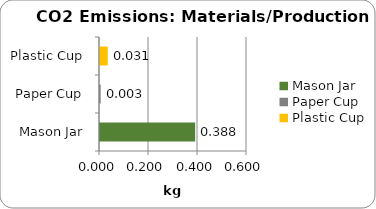
| Category | Series 0 |
|---|---|
| Mason Jar | 0.388 |
| Paper Cup | 0.003 |
| Plastic Cup | 0.031 |